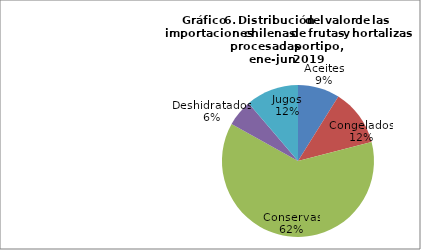
| Category | Series 0 |
|---|---|
| Aceites | 17612673.25 |
| Congelados | 23841338.18 |
| Conservas | 122788602.94 |
| Deshidratados | 11233517.7 |
| Jugos | 22255054.04 |